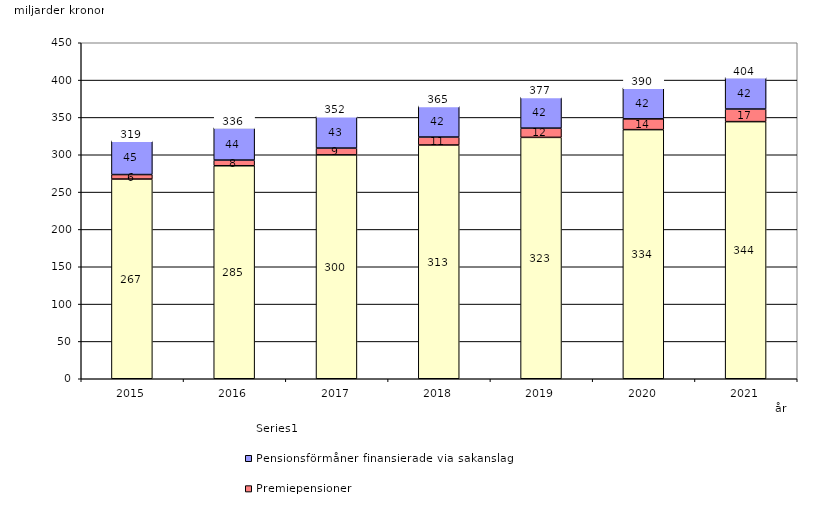
| Category | Inkomstpension och tilläggspension m.m. | Premiepensioner | Pensionsförmåner finansierade via sakanslag | Series 0 |
|---|---|---|---|---|
| 2015.0 | 267.466 | 6.008 | 45.361 | 20 |
| 2016.0 | 285.286 | 7.598 | 43.543 | 20 |
| 2017.0 | 299.835 | 9.105 | 42.686 | 20 |
| 2018.0 | 313.067 | 10.662 | 41.721 | 20 |
| 2019.0 | 323.287 | 12.385 | 41.518 | 20 |
| 2020.0 | 333.641 | 14.435 | 41.801 | 20 |
| 2021.0 | 344.359 | 16.884 | 42.462 | 20 |